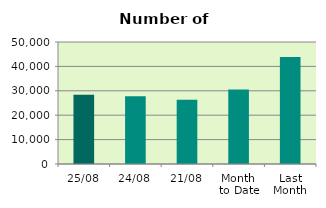
| Category | Series 0 |
|---|---|
| 25/08 | 28380 |
| 24/08 | 27716 |
| 21/08 | 26282 |
| Month 
to Date | 30498.941 |
| Last
Month | 43867.217 |